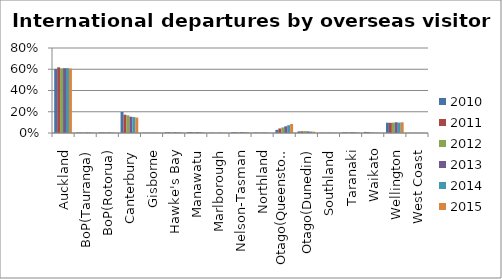
| Category | 2010 | 2011 | 2012 | 2013 | 2014 | 2015 |
|---|---|---|---|---|---|---|
| Auckland | 0.603 | 0.618 | 0.608 | 0.61 | 0.611 | 0.607 |
| BoP(Tauranga) | 0.004 | 0.004 | 0.004 | 0.005 | 0.005 | 0.004 |
| BoP(Rotorua) | 0.005 | 0.005 | 0.006 | 0.006 | 0.004 | 0.003 |
| Canterbury | 0.198 | 0.172 | 0.166 | 0.153 | 0.15 | 0.145 |
| Gisborne | 0.002 | 0.002 | 0.002 | 0.002 | 0.002 | 0.002 |
| Hawke's Bay | 0.007 | 0.007 | 0.007 | 0.008 | 0.007 | 0.008 |
| Manawatu | 0.008 | 0.008 | 0.009 | 0.009 | 0.008 | 0.008 |
| Marlborough | 0.002 | 0.002 | 0.002 | 0.003 | 0.003 | 0.003 |
| Nelson-Tasman | 0.007 | 0.007 | 0.008 | 0.008 | 0.008 | 0.009 |
| Northland | 0.004 | 0.003 | 0.003 | 0.004 | 0.004 | 0.003 |
| Otago(Queenstown) | 0.03 | 0.043 | 0.052 | 0.063 | 0.074 | 0.085 |
| Otago(Dunedin) | 0.015 | 0.016 | 0.018 | 0.016 | 0.014 | 0.012 |
| Southland | 0.002 | 0.002 | 0.002 | 0.002 | 0.002 | 0.002 |
| Taranaki | 0.006 | 0.006 | 0.007 | 0.008 | 0.007 | 0.007 |
| Waikato | 0.01 | 0.008 | 0.006 | 0.003 | 0.002 | 0.002 |
| Wellington | 0.097 | 0.096 | 0.097 | 0.101 | 0.098 | 0.101 |
| West Coast | 0 | 0 | 0 | 0 | 0 | 0 |